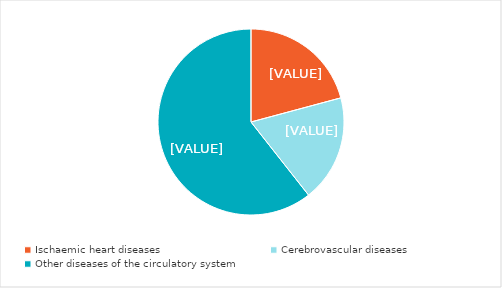
| Category | Series 0 |
|---|---|
| Ischaemic heart diseases | 20.823 |
| Cerebrovascular diseases | 18.561 |
| Other diseases of the circulatory system | 60.616 |